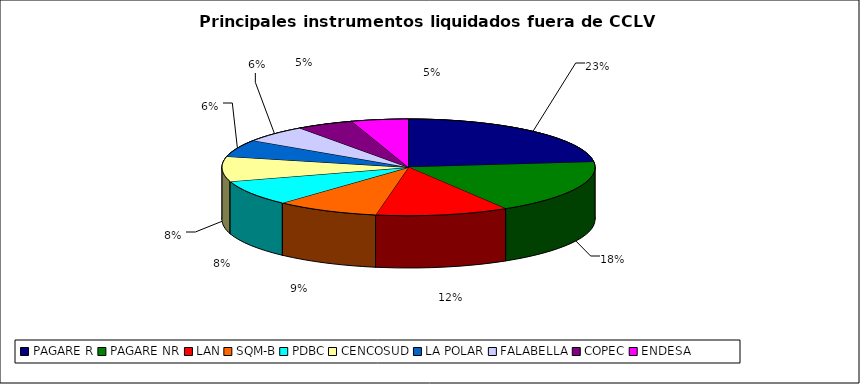
| Category | Series 0 |
|---|---|
| PAGARE R | 1746 |
| PAGARE NR | 1353 |
| LAN | 866 |
| SQM-B | 675 |
| PDBC | 636 |
| CENCOSUD | 627 |
| LA POLAR | 431 |
| FALABELLA | 429 |
| COPEC | 374 |
| ENDESA | 369 |